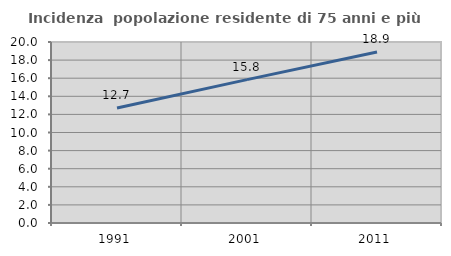
| Category | Incidenza  popolazione residente di 75 anni e più |
|---|---|
| 1991.0 | 12.715 |
| 2001.0 | 15.845 |
| 2011.0 | 18.9 |